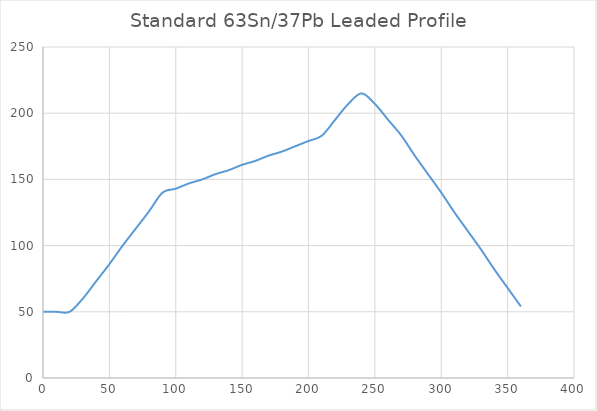
| Category | Standard 63Sn/37Pb Leaded Profile |
|---|---|
| 0.0 | 50 |
| 10.0 | 50 |
| 20.0 | 50 |
| 30.0 | 60 |
| 40.0 | 73 |
| 50.0 | 86 |
| 60.0 | 100 |
| 70.0 | 113 |
| 80.0 | 126 |
| 90.0 | 140 |
| 100.0 | 143 |
| 110.0 | 147 |
| 120.0 | 150 |
| 130.0 | 154 |
| 140.0 | 157 |
| 150.0 | 161 |
| 160.0 | 164 |
| 170.0 | 168 |
| 180.0 | 171 |
| 190.0 | 175 |
| 200.0 | 179 |
| 210.0 | 183 |
| 220.0 | 195 |
| 230.0 | 207 |
| 240.0 | 215 |
| 250.0 | 207 |
| 260.0 | 195 |
| 270.0 | 183 |
| 280.0 | 168 |
| 290.0 | 154 |
| 300.0 | 140 |
| 310.0 | 125 |
| 320.0 | 111 |
| 330.0 | 97 |
| 340.0 | 82 |
| 350.0 | 68 |
| 360.0 | 54 |